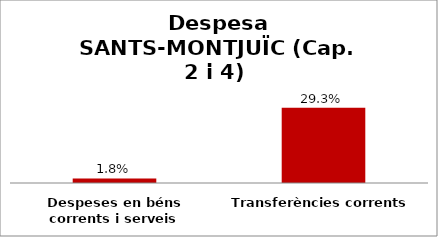
| Category | Series 0 |
|---|---|
| Despeses en béns corrents i serveis | 0.018 |
| Transferències corrents | 0.293 |